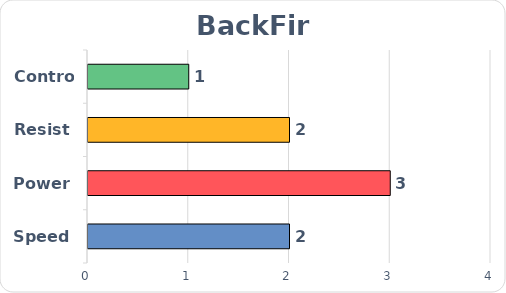
| Category | Series 0 |
|---|---|
| Speed | 2 |
| Power | 3 |
| Resist | 2 |
| Control | 1 |